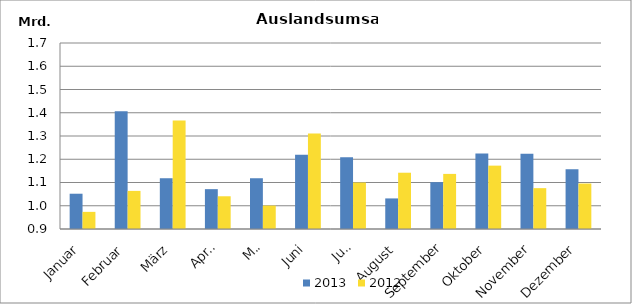
| Category | 2013 | 2012 |
|---|---|---|
| Januar | 1051730.163 | 973708.294 |
| Februar | 1406322.444 | 1063868.944 |
| März | 1118336.588 | 1366552.107 |
| April | 1071396.399 | 1040755.882 |
| Mai | 1118325.392 | 1000767.906 |
| Juni | 1219165.762 | 1310803.972 |
| Juli | 1209080.774 | 1099928.259 |
| August | 1031513.061 | 1142042.973 |
| September | 1101427.152 | 1136974.708 |
| Oktober | 1225127.567 | 1172546.632 |
| November | 1223659.455 | 1075705.041 |
| Dezember | 1157019.441 | 1095579.021 |